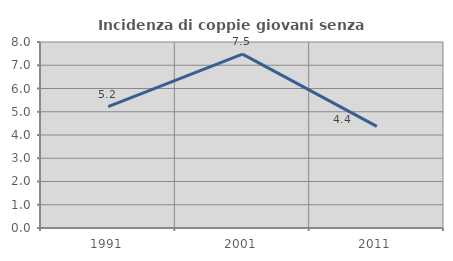
| Category | Incidenza di coppie giovani senza figli |
|---|---|
| 1991.0 | 5.219 |
| 2001.0 | 7.477 |
| 2011.0 | 4.371 |